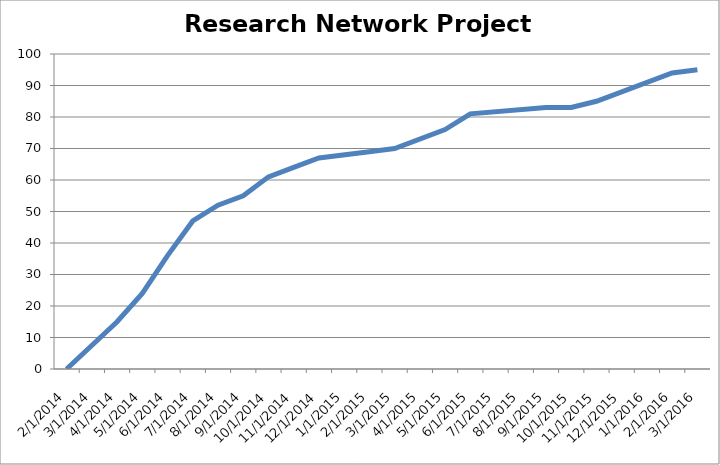
| Category | Research Network Project Status |
|---|---|
| 2/27/14 | 0 |
| 4/1/14 | 15 |
| 5/1/14 | 24 |
| 6/1/14 | 36 |
| 7/1/14 | 47 |
| 8/1/14 | 52 |
| 9/1/14 | 55 |
| 10/1/14 | 61 |
| 11/1/14 | 64 |
| 12/22/14 | 67 |
| 2/2/15 | 69 |
| 3/5/15 | 70 |
| 5/1/15 | 76 |
| 6/1/15 | 81 |
| 9/1/15 | 83 |
| 10/1/15 | 83 |
| 11/2/15 | 85 |
| 2/1/16 | 94 |
| 3/1/16 | 95 |